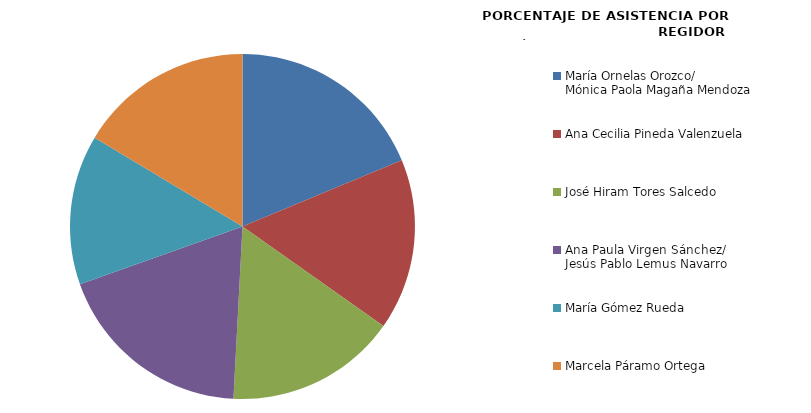
| Category | Series 0 |
|---|---|
| María Ornelas Orozco/
Mónica Paola Magaña Mendoza | 100 |
| Ana Cecilia Pineda Valenzuela | 85.714 |
| José Hiram Tores Salcedo | 85.714 |
| Ana Paula Virgen Sánchez/
Jesús Pablo Lemus Navarro | 100 |
| María Gómez Rueda | 75 |
| Marcela Páramo Ortega | 87.5 |